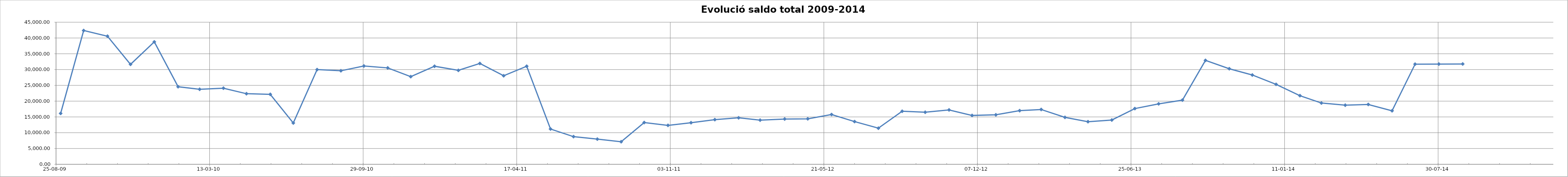
| Category | TOTAL € |
|---|---|
| 40056.0 | 16123.59 |
| 40086.0 | 42373.59 |
| 40117.0 | 40572.08 |
| 40147.0 | 31652.9 |
| 40178.0 | 38775.08 |
| 40209.0 | 24566.56 |
| 40237.0 | 23765.41 |
| 40268.0 | 24105.41 |
| 40298.0 | 22358.72 |
| 40329.0 | 22155.93 |
| 40359.0 | 13081.4 |
| 40390.0 | 29999.3 |
| 40421.0 | 29619.72 |
| 40451.0 | 31138.57 |
| 40482.0 | 30529.74 |
| 40512.0 | 27767.46 |
| 40543.0 | 31060.05 |
| 40574.0 | 29753.09 |
| 40602.0 | 31936.35 |
| 40633.0 | 28051.12 |
| 40663.0 | 31065 |
| 40694.0 | 11175.81 |
| 40724.0 | 8761.2 |
| 40755.0 | 7976 |
| 40786.0 | 7149.72 |
| 40816.0 | 13220.55 |
| 40847.0 | 12334.61 |
| 40877.0 | 13175.63 |
| 40908.0 | 14146.76 |
| 40939.0 | 14722.02 |
| 40967.0 | 13985.51 |
| 40999.0 | 14338.84 |
| 41029.0 | 14396.73 |
| 41060.0 | 15766.28 |
| 41090.0 | 13525.07 |
| 41121.0 | 11439.99 |
| 41152.0 | 16797.86 |
| 41182.0 | 16495.87 |
| 41213.0 | 17221.88 |
| 41243.0 | 15477.16 |
| 41274.0 | 15676.6 |
| 41305.0 | 16989.48 |
| 41333.0 | 17358.89 |
| 41364.0 | 14859.79 |
| 41394.0 | 13486.75 |
| 41425.0 | 14023.72 |
| 41455.0 | 17644.35 |
| 41486.0 | 19148.33 |
| 41517.0 | 20328.8 |
| 41547.0 | 32911.35 |
| 41578.0 | 30264.25 |
| 41608.0 | 28285.67 |
| 41639.0 | 25323.36 |
| 41670.0 | 21735.21 |
| 41698.0 | 19412.07 |
| 41729.0 | 18719.44 |
| 41759.0 | 18951.95 |
| 41790.0 | 16953.93 |
| 41820.0 | 31717.65 |
| 41851.0 | 31751.6 |
| 41882.0 | 31776.9 |